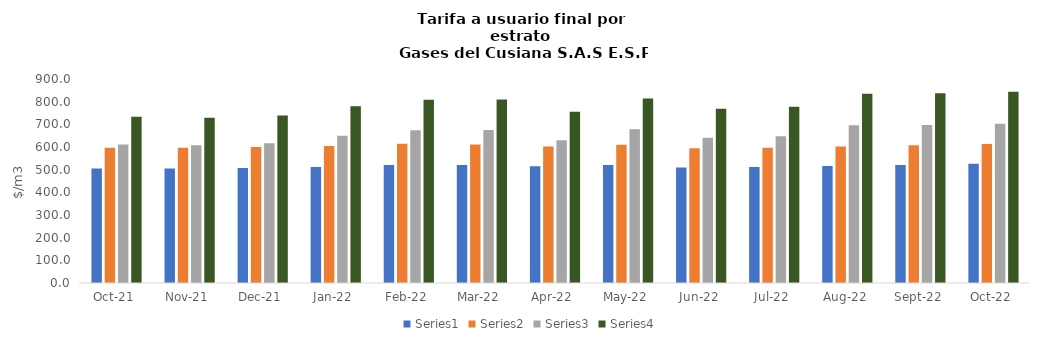
| Category | Series 0 | Series 1 | Series 2 | Series 3 |
|---|---|---|---|---|
| 2021-10-01 | 505.22 | 596.82 | 611.56 | 733.872 |
| 2021-11-01 | 505.22 | 596.82 | 607.6 | 729.12 |
| 2021-12-01 | 507.79 | 599.85 | 616.19 | 739.428 |
| 2022-01-01 | 511.59 | 604.34 | 649.72 | 779.664 |
| 2022-02-01 | 520.48 | 614.84 | 674.14 | 808.968 |
| 2022-03-01 | 520.77 | 611.26 | 674.47 | 809.364 |
| 2022-04-01 | 514.86 | 602.49 | 629.43 | 755.316 |
| 2022-05-01 | 520.65 | 609.98 | 678.32 | 813.984 |
| 2022-06-01 | 509.1 | 593.97 | 640.64 | 768.768 |
| 2022-07-01 | 511.66 | 596.96 | 647.86 | 777.432 |
| 2022-08-01 | 515.81 | 601.8 | 695.58 | 834.696 |
| 2022-09-01 | 521.11 | 607.98 | 697.25 | 836.7 |
| 2022-10-01 | 525.98 | 613.66 | 702.69 | 843.228 |